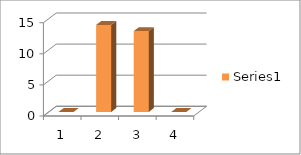
| Category | Series 0 |
|---|---|
| 0 | 0 |
| 1 | 14 |
| 2 | 13 |
| 3 | 0 |